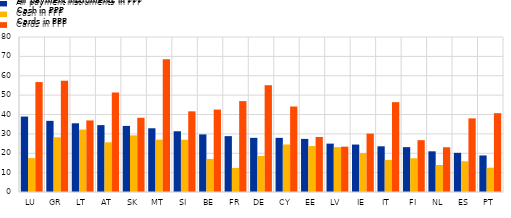
| Category | All payment instruments in PPP | Cash in PPP | Cards in PPP |
|---|---|---|---|
| LU | 38.94 | 17.49 | 56.73 |
| GR | 36.73 | 28.24 | 57.45 |
| LT | 35.46 | 32.24 | 36.94 |
| AT | 34.52 | 25.64 | 51.38 |
| SK | 34.11 | 29.25 | 38.3 |
| MT | 32.89 | 27.03 | 68.57 |
| SI | 31.35 | 26.96 | 41.63 |
| BE | 29.73 | 17.08 | 42.54 |
| FR | 28.83 | 12.42 | 46.91 |
| DE | 27.96 | 18.6 | 55.12 |
| CY | 27.95 | 24.52 | 44.12 |
| EE | 27.4 | 23.71 | 28.4 |
| LV | 24.97 | 23.16 | 23.4 |
| IE | 24.49 | 20.08 | 30.14 |
| IT | 23.58 | 16.58 | 46.37 |
| FI | 23.15 | 17.42 | 26.75 |
| NL | 21 | 13.93 | 23.09 |
| ES | 20.22 | 15.88 | 38.01 |
| PT | 18.87 | 12.53 | 40.68 |